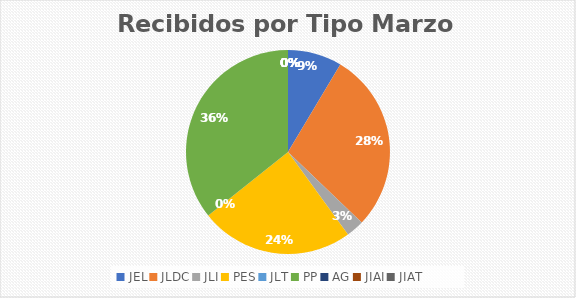
| Category | Series 0 |
|---|---|
| JEL | 6 |
| JLDC | 20 |
| JLI | 2 |
| PES | 17 |
| JLT | 0 |
| PP | 25 |
| AG | 0 |
| JIAI | 0 |
| JIAT | 0 |